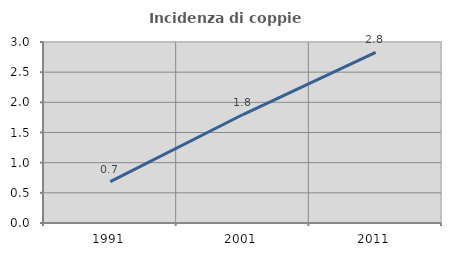
| Category | Incidenza di coppie miste |
|---|---|
| 1991.0 | 0.685 |
| 2001.0 | 1.798 |
| 2011.0 | 2.828 |